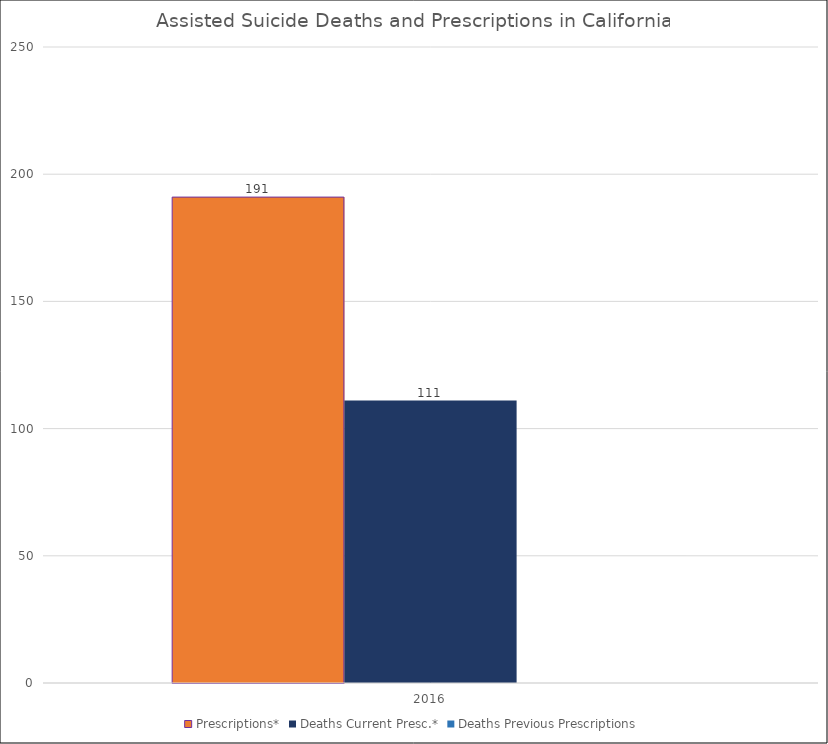
| Category | Prescriptions* | Deaths Current Presc.* | Deaths Previous Prescriptions |
|---|---|---|---|
| 2016.0 | 191 | 111 | 0 |